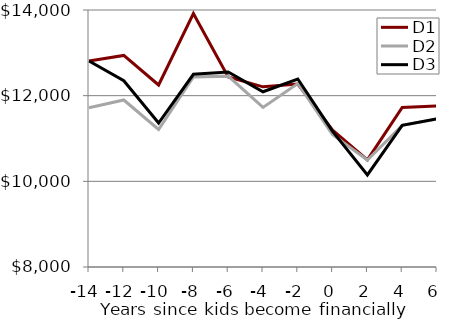
| Category | D1 | D2 | D3 |
|---|---|---|---|
| -14.0 | 12809.08 | 11718.86 | 12809.08 |
| -12.0 | 12939.85 | 11899.15 | 12348.03 |
| -10.0 | 12249.12 | 11210.58 | 11361.32 |
| -8.0 | 13915.69 | 12436.97 | 12498.35 |
| -6.0 | 12436.27 | 12456.2 | 12552.13 |
| -4.0 | 12205.69 | 11726.47 | 12091.5 |
| -2.0 | 12271.32 | 12283.95 | 12389.11 |
| 0.0 | 11196.44 | 11091.3 | 11166.91 |
| 2.0 | 10499.52 | 10499.25 | 10149.27 |
| 4.0 | 11726.47 | 11307.67 | 11307.67 |
| 6.0 | 11757.49 | 11455.61 | 11460 |